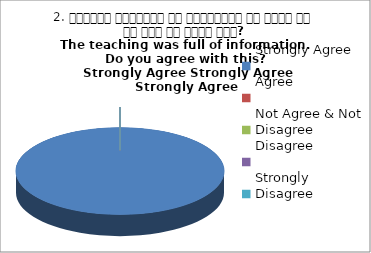
| Category | 2. शिक्षण जानकारी से परिपूर्ण था क्या आप इस बात से सहमत हैं?
The teaching was full of information. Do you agree with this?
 Strongly Agree Strongly Agree Strongly Agree |
|---|---|
| Strongly Agree | 3 |
| Agree | 0 |
| Not Agree & Not Disagree | 0 |
| Disagree | 0 |
| Strongly Disagree | 0 |